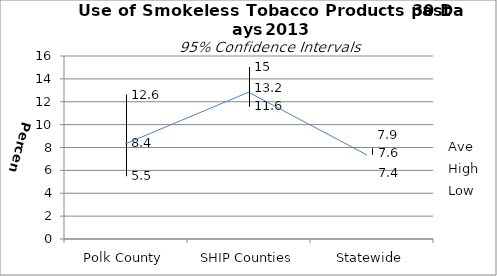
| Category | Ave | High | Low |
|---|---|---|---|
| Polk County | 8.4 | 12.6 | 5.5 |
| SHIP Counties | 13.2 | 15 | 11.6 |
| Statewide | 7.6 | 7.9 | 7.4 |